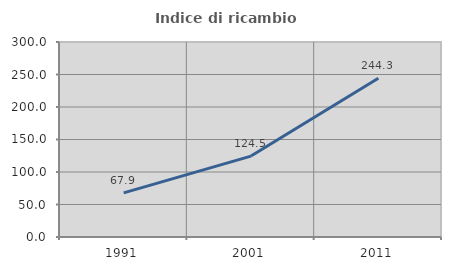
| Category | Indice di ricambio occupazionale  |
|---|---|
| 1991.0 | 67.868 |
| 2001.0 | 124.472 |
| 2011.0 | 244.28 |